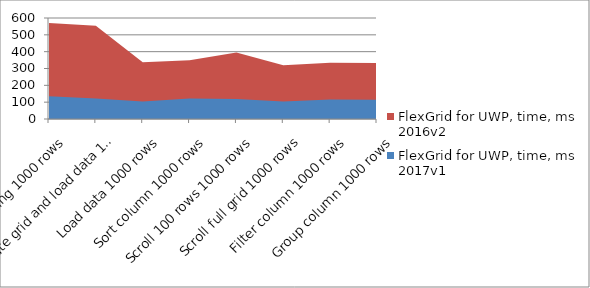
| Category | FlexGrid for UWP, time, ms 2016v2 | FlexGrid for UWP, time, ms 2017v1 |
|---|---|---|
| First loading 1000 rows | 571 | 135 |
| Create grid and load data 1000 rows | 553.6 | 121.8 |
| Load data 1000 rows | 336.9 | 104.5 |
| Sort column 1000 rows | 349.6 | 121.8 |
| Scroll 100 rows 1000 rows | 394.6 | 119.4 |
| Scroll full grid 1000 rows | 319.7 | 104.6 |
| Filter column 1000 rows | 333.5 | 115.8 |
| Group column 1000 rows | 332.3 | 114 |